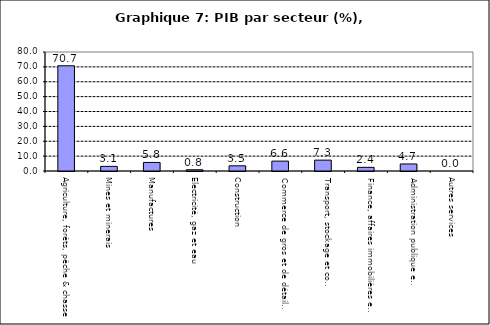
| Category | Series 0 |
|---|---|
| Agriculture, forêts, pêche & chasse | 70.735 |
| Mines et minerais | 3.11 |
| Manufactures | 5.764 |
| Electricité, gaz et eau | 0.847 |
| Construction | 3.483 |
| Commerce de gros et de détail, hôtels et restaurants | 6.649 |
| Transport, stockage et communications                | 7.306 |
| Finance, affaires immobilières et services | 2.45 |
| Administration publique et defense       | 4.729 |
| Autres services                        | 0 |